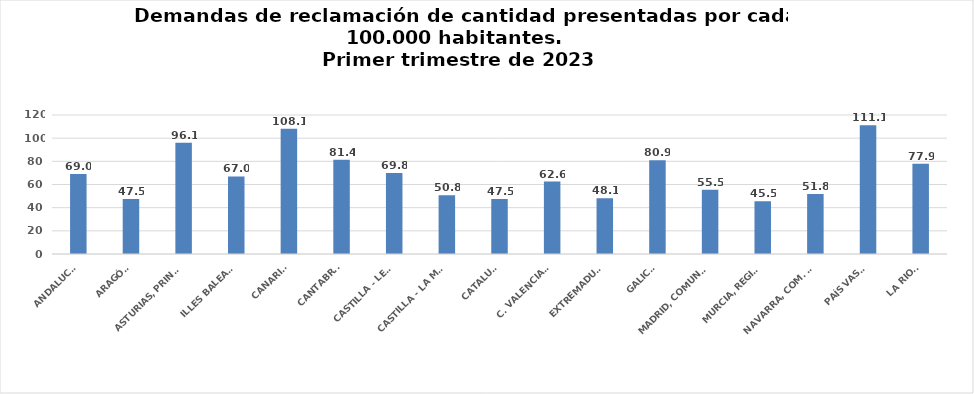
| Category | Series 0 |
|---|---|
| ANDALUCÍA | 69.044 |
| ARAGÓN | 47.505 |
| ASTURIAS, PRINCIPADO | 96.065 |
| ILLES BALEARS | 66.958 |
| CANARIAS | 108.093 |
| CANTABRIA | 81.389 |
| CASTILLA - LEÓN | 69.841 |
| CASTILLA - LA MANCHA | 50.754 |
| CATALUÑA | 47.461 |
| C. VALENCIANA | 62.588 |
| EXTREMADURA | 48.089 |
| GALICIA | 80.934 |
| MADRID, COMUNIDAD | 55.454 |
| MURCIA, REGIÓN | 45.534 |
| NAVARRA, COM. FORAL | 51.77 |
| PAÍS VASCO | 111.131 |
| LA RIOJA | 77.887 |